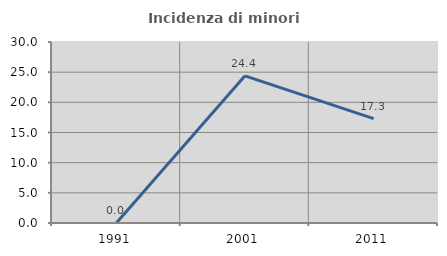
| Category | Incidenza di minori stranieri |
|---|---|
| 1991.0 | 0 |
| 2001.0 | 24.39 |
| 2011.0 | 17.293 |